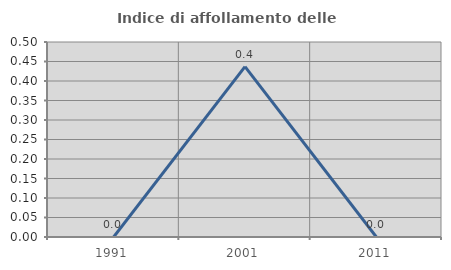
| Category | Indice di affollamento delle abitazioni  |
|---|---|
| 1991.0 | 0 |
| 2001.0 | 0.437 |
| 2011.0 | 0 |